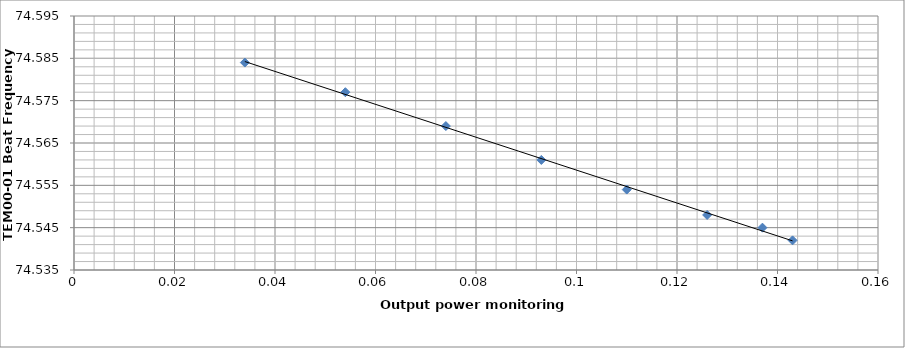
| Category | Series 0 |
|---|---|
| 0.143 | 74.542 |
| 0.137 | 74.545 |
| 0.126 | 74.548 |
| 0.11 | 74.554 |
| 0.093 | 74.561 |
| 0.074 | 74.569 |
| 0.054 | 74.577 |
| 0.034 | 74.584 |